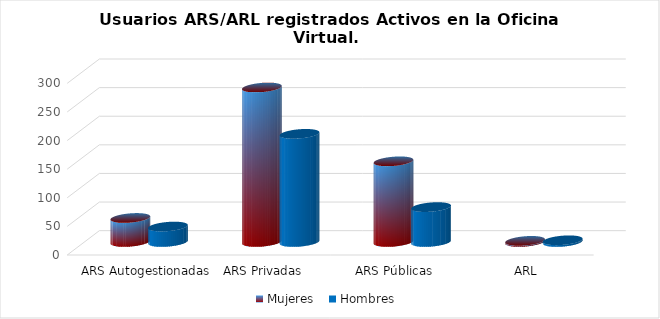
| Category | Mujeres | Hombres |
|---|---|---|
| ARS Autogestionadas | 42 | 27 |
| ARS Privadas | 270 | 189 |
| ARS Públicas | 141 | 61 |
| ARL | 2 | 3 |